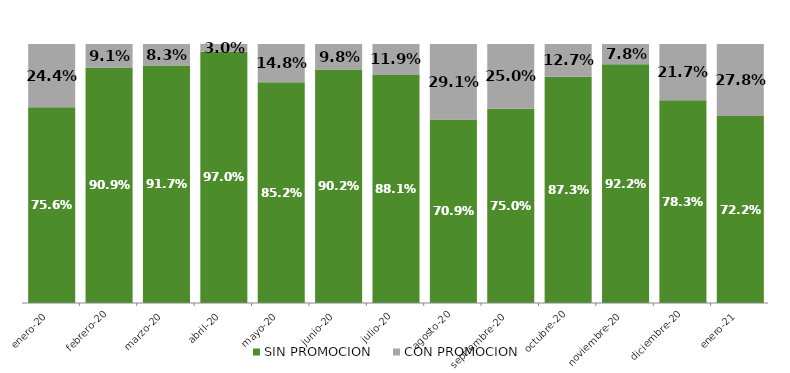
| Category | SIN PROMOCION   | CON PROMOCION   |
|---|---|---|
| 2020-01-01 | 0.756 | 0.244 |
| 2020-02-01 | 0.909 | 0.091 |
| 2020-03-01 | 0.917 | 0.083 |
| 2020-04-01 | 0.97 | 0.03 |
| 2020-05-01 | 0.852 | 0.148 |
| 2020-06-01 | 0.902 | 0.098 |
| 2020-07-01 | 0.881 | 0.119 |
| 2020-08-01 | 0.709 | 0.291 |
| 2020-09-01 | 0.75 | 0.25 |
| 2020-10-01 | 0.873 | 0.127 |
| 2020-11-01 | 0.922 | 0.078 |
| 2020-12-01 | 0.783 | 0.217 |
| 2021-01-01 | 0.722 | 0.278 |